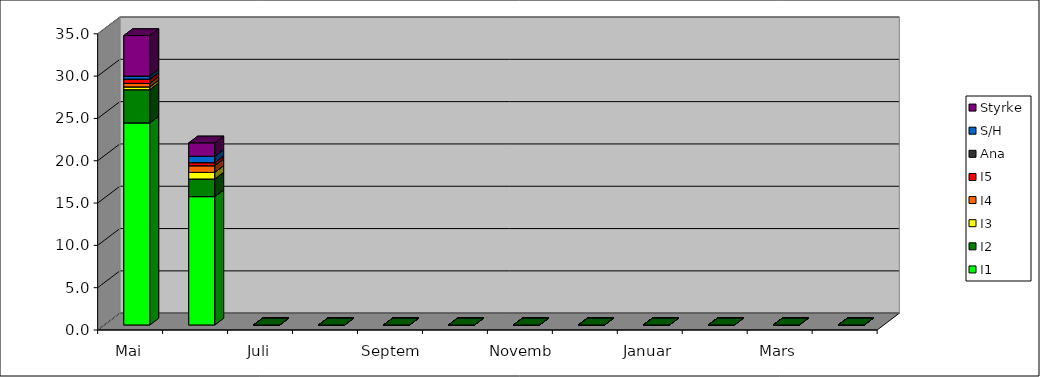
| Category | I1 | I2 | I3 | I4 | I5 | Ana | S/H | Styrke |
|---|---|---|---|---|---|---|---|---|
| Mai | 23.883 | 3.917 | 0.333 | 0.417 | 0.5 | 0 | 0.367 | 4.783 |
| Juni | 15.167 | 2.083 | 0.783 | 0.783 | 0.367 | 0 | 0.75 | 1.583 |
| Juli | 0 | 0 | 0 | 0 | 0 | 0 | 0 | 0 |
| August | 0 | 0 | 0 | 0 | 0 | 0 | 0 | 0 |
| September | 0 | 0 | 0 | 0 | 0 | 0 | 0 | 0 |
| Oktober | 0 | 0 | 0 | 0 | 0 | 0 | 0 | 0 |
| November | 0 | 0 | 0 | 0 | 0 | 0 | 0 | 0 |
| Desember | 0 | 0 | 0 | 0 | 0 | 0 | 0 | 0 |
| Januar | 0 | 0 | 0 | 0 | 0 | 0 | 0 | 0 |
| Februar | 0 | 0 | 0 | 0 | 0 | 0 | 0 | 0 |
| Mars | 0 | 0 | 0 | 0 | 0 | 0 | 0 | 0 |
| April | 0 | 0 | 0 | 0 | 0 | 0 | 0 | 0 |